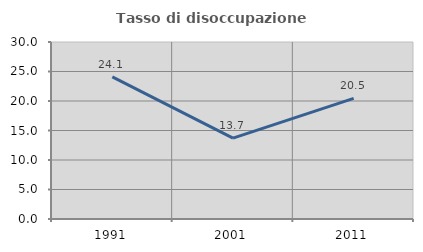
| Category | Tasso di disoccupazione giovanile  |
|---|---|
| 1991.0 | 24.088 |
| 2001.0 | 13.71 |
| 2011.0 | 20.455 |